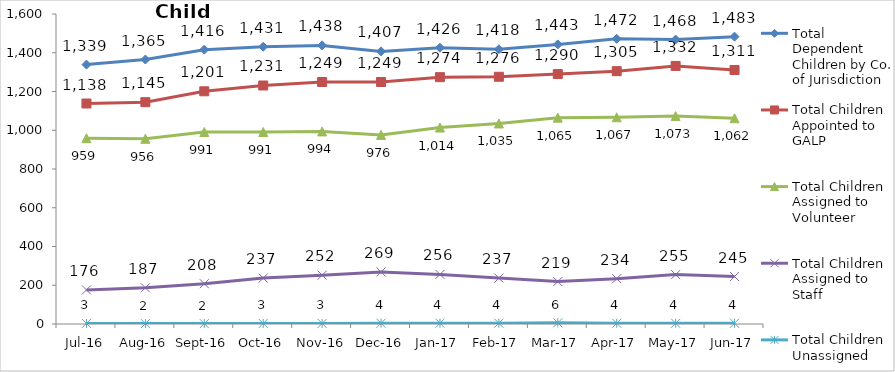
| Category | Total Dependent Children by Co. of Jurisdiction | Total Children Appointed to GALP | Total Children Assigned to Volunteer | Total Children Assigned to Staff | Total Children Unassigned |
|---|---|---|---|---|---|
| Jul-16 | 1339 | 1138 | 959 | 176 | 3 |
| Aug-16 | 1365 | 1145 | 956 | 187 | 2 |
| Sep-16 | 1416 | 1201 | 991 | 208 | 2 |
| Oct-16 | 1431 | 1231 | 991 | 237 | 3 |
| Nov-16 | 1438 | 1249 | 994 | 252 | 3 |
| Dec-16 | 1407 | 1249 | 976 | 269 | 4 |
| Jan-17 | 1426 | 1274 | 1014 | 256 | 4 |
| Feb-17 | 1418 | 1276 | 1035 | 237 | 4 |
| Mar-17 | 1443 | 1290 | 1065 | 219 | 6 |
| Apr-17 | 1472 | 1305 | 1067 | 234 | 4 |
| May-17 | 1468 | 1332 | 1073 | 255 | 4 |
| Jun-17 | 1483 | 1311 | 1062 | 245 | 4 |